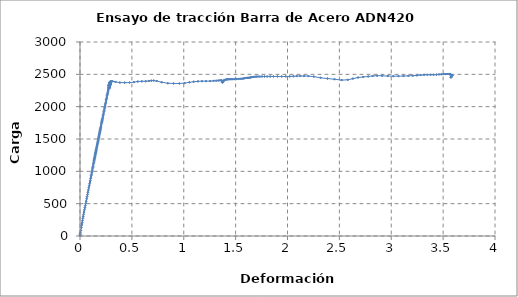
| Category | Series 0 |
|---|---|
| 0.0 | 20.252 |
| 0.0003 | 2.587 |
| 0.0011 | 17.122 |
| 0.0022 | 31.6 |
| 0.004 | 50.392 |
| 0.0077 | 84.81 |
| 0.0124 | 131.125 |
| 0.0156 | 165.035 |
| 0.0178 | 186.205 |
| 0.0202 | 208.553 |
| 0.0237 | 239.546 |
| 0.0274 | 273.107 |
| 0.0308 | 304.433 |
| 0.0346 | 336.48 |
| 0.0386 | 369.845 |
| 0.0427 | 402.87 |
| 0.0468 | 436.396 |
| 0.0511 | 470.818 |
| 0.0555 | 505 |
| 0.0599 | 539.282 |
| 0.064 | 574.271 |
| 0.0681 | 608.578 |
| 0.0726 | 642.638 |
| 0.0768 | 676.378 |
| 0.0808 | 710.499 |
| 0.0848 | 744.043 |
| 0.0889 | 776.463 |
| 0.0926 | 806.376 |
| 0.0961 | 834.854 |
| 0.0994 | 861.845 |
| 0.1025 | 887.574 |
| 0.1054 | 911.499 |
| 0.1081 | 934.991 |
| 0.1108 | 957.132 |
| 0.1134 | 977.642 |
| 0.1159 | 997.762 |
| 0.1182 | 1018.121 |
| 0.1205 | 1038.109 |
| 0.1229 | 1058.009 |
| 0.1255 | 1078.018 |
| 0.1279 | 1098.199 |
| 0.1302 | 1119.034 |
| 0.1327 | 1138.983 |
| 0.1349 | 1157.536 |
| 0.1361 | 1169.744 |
| 0.137 | 1178.703 |
| 0.1385 | 1191.244 |
| 0.1401 | 1203.536 |
| 0.1418 | 1214.996 |
| 0.1433 | 1226.086 |
| 0.1447 | 1237.422 |
| 0.146 | 1248.94 |
| 0.1473 | 1260.346 |
| 0.1486 | 1271.864 |
| 0.1499 | 1282.808 |
| 0.1515 | 1293.88 |
| 0.153 | 1305.526 |
| 0.1544 | 1316.569 |
| 0.1556 | 1327.424 |
| 0.157 | 1339.923 |
| 0.1587 | 1353.095 |
| 0.1604 | 1366.406 |
| 0.162 | 1379.584 |
| 0.1637 | 1392.507 |
| 0.1654 | 1405.933 |
| 0.1672 | 1418.77 |
| 0.169 | 1431.317 |
| 0.1707 | 1444.793 |
| 0.1723 | 1458.19 |
| 0.1739 | 1470.752 |
| 0.1754 | 1483.403 |
| 0.1771 | 1497.101 |
| 0.1788 | 1509.976 |
| 0.1804 | 1522.771 |
| 0.182 | 1536.359 |
| 0.1836 | 1549.864 |
| 0.1852 | 1563.447 |
| 0.1869 | 1576.919 |
| 0.1887 | 1590.353 |
| 0.1904 | 1604.173 |
| 0.1921 | 1617.648 |
| 0.1937 | 1630.912 |
| 0.1953 | 1644.644 |
| 0.197 | 1658.337 |
| 0.1989 | 1671.729 |
| 0.2006 | 1685.124 |
| 0.2024 | 1699.4 |
| 0.2045 | 1717.195 |
| 0.2067 | 1735.7 |
| 0.2088 | 1752.927 |
| 0.2109 | 1769.199 |
| 0.213 | 1785.744 |
| 0.2152 | 1802.355 |
| 0.2173 | 1819.213 |
| 0.2197 | 1838.036 |
| 0.2224 | 1859.03 |
| 0.225 | 1880.588 |
| 0.2276 | 1901.818 |
| 0.2302 | 1922.927 |
| 0.2329 | 1944.014 |
| 0.2356 | 1965.342 |
| 0.2383 | 1986.516 |
| 0.241 | 2007.351 |
| 0.2435 | 2027.934 |
| 0.2459 | 2048.13 |
| 0.2485 | 2068.718 |
| 0.2511 | 2089.058 |
| 0.2537 | 2109.135 |
| 0.256 | 2129.117 |
| 0.2584 | 2148.899 |
| 0.2608 | 2168.698 |
| 0.2632 | 2187.789 |
| 0.2656 | 2205.858 |
| 0.2679 | 2223.226 |
| 0.2701 | 2240.559 |
| 0.2721 | 2257.028 |
| 0.2739 | 2271.59 |
| 0.2754 | 2284.724 |
| 0.277 | 2296.841 |
| 0.2786 | 2309.466 |
| 0.2801 | 2322.302 |
| 0.2816 | 2332.947 |
| 0.2826 | 2340.655 |
| 0.2829 | 2343.912 |
| 0.2829 | 2342.713 |
| 0.2827 | 2328.255 |
| 0.2824 | 2305.382 |
| 0.2823 | 2293.38 |
| 0.2823 | 2291.865 |
| 0.2825 | 2292.494 |
| 0.2824 | 2293.444 |
| 0.2824 | 2294.837 |
| 0.2823 | 2295.813 |
| 0.2823 | 2293.757 |
| 0.2822 | 2289.784 |
| 0.2822 | 2287.394 |
| 0.2823 | 2287.536 |
| 0.2823 | 2291.576 |
| 0.2823 | 2298.981 |
| 0.2825 | 2306.908 |
| 0.2825 | 2314.133 |
| 0.2824 | 2319.514 |
| 0.2824 | 2324.425 |
| 0.2825 | 2328.965 |
| 0.2826 | 2330.46 |
| 0.2826 | 2329.099 |
| 0.2824 | 2325.907 |
| 0.2824 | 2322.364 |
| 0.2825 | 2320.977 |
| 0.2825 | 2320.819 |
| 0.2824 | 2321.028 |
| 0.2824 | 2322.32 |
| 0.2825 | 2324.188 |
| 0.2824 | 2324.896 |
| 0.2824 | 2326.439 |
| 0.2824 | 2328.544 |
| 0.2825 | 2328.876 |
| 0.2825 | 2328.828 |
| 0.2826 | 2329.976 |
| 0.2826 | 2332.974 |
| 0.2826 | 2335.172 |
| 0.2826 | 2334.534 |
| 0.2826 | 2333.924 |
| 0.2827 | 2334.774 |
| 0.2827 | 2336.736 |
| 0.2832 | 2341.441 |
| 0.2846 | 2349.695 |
| 0.2857 | 2357.464 |
| 0.2861 | 2360.794 |
| 0.2861 | 2362.332 |
| 0.2865 | 2365.658 |
| 0.2871 | 2368.932 |
| 0.2874 | 2370.21 |
| 0.2875 | 2368.027 |
| 0.2875 | 2365.389 |
| 0.2877 | 2368.166 |
| 0.2883 | 2374.272 |
| 0.2889 | 2378.527 |
| 0.289 | 2378.576 |
| 0.289 | 2372.524 |
| 0.2891 | 2363.6 |
| 0.2891 | 2358.206 |
| 0.2891 | 2356.979 |
| 0.2892 | 2357.518 |
| 0.2892 | 2358.307 |
| 0.2891 | 2352.696 |
| 0.289 | 2344.218 |
| 0.2889 | 2341.188 |
| 0.2889 | 2339.411 |
| 0.2888 | 2336.646 |
| 0.2888 | 2336.129 |
| 0.2889 | 2340.492 |
| 0.2889 | 2347.5 |
| 0.2889 | 2347.732 |
| 0.2888 | 2340.598 |
| 0.2888 | 2336.224 |
| 0.2888 | 2335.679 |
| 0.2888 | 2336.302 |
| 0.2888 | 2344.869 |
| 0.2889 | 2357.874 |
| 0.289 | 2365.487 |
| 0.289 | 2367.335 |
| 0.289 | 2364.825 |
| 0.2889 | 2358.555 |
| 0.2889 | 2353.921 |
| 0.2889 | 2354.028 |
| 0.2888 | 2355.803 |
| 0.2889 | 2357.258 |
| 0.2889 | 2357.696 |
| 0.2888 | 2356.885 |
| 0.2887 | 2348.767 |
| 0.2885 | 2327.922 |
| 0.2884 | 2321.1 |
| 0.2886 | 2344.582 |
| 0.2894 | 2369.315 |
| 0.2908 | 2384.343 |
| 0.2928 | 2390.792 |
| 0.2968 | 2391.709 |
| 0.3033 | 2392.281 |
| 0.3147 | 2392.346 |
| 0.342 | 2382.713 |
| 0.3841 | 2372.302 |
| 0.4309 | 2371.423 |
| 0.4777 | 2372.282 |
| 0.5195 | 2379.375 |
| 0.5576 | 2388.691 |
| 0.5962 | 2391.894 |
| 0.6335 | 2393.15 |
| 0.6642 | 2397.654 |
| 0.6879 | 2402.379 |
| 0.7096 | 2403.398 |
| 0.739 | 2396.916 |
| 0.7875 | 2378.154 |
| 0.8463 | 2362.039 |
| 0.9023 | 2358.891 |
| 0.9571 | 2358.284 |
| 1.0078 | 2363.991 |
| 1.0535 | 2376.299 |
| 1.096 | 2385.726 |
| 1.1367 | 2391.366 |
| 1.1752 | 2394.197 |
| 1.2147 | 2394.756 |
| 1.254 | 2395.843 |
| 1.287 | 2398.777 |
| 1.3121 | 2401.933 |
| 1.3317 | 2404.312 |
| 1.3491 | 2407.181 |
| 1.3641 | 2410.378 |
| 1.3718 | 2395.791 |
| 1.3728 | 2377.052 |
| 1.374 | 2376.515 |
| 1.3769 | 2385.232 |
| 1.381 | 2394.642 |
| 1.3865 | 2403.645 |
| 1.3935 | 2411.948 |
| 1.402 | 2417.826 |
| 1.4113 | 2420.808 |
| 1.4207 | 2422.061 |
| 1.4301 | 2423.534 |
| 1.4395 | 2424.878 |
| 1.4498 | 2425.339 |
| 1.4613 | 2425.395 |
| 1.4747 | 2425.26 |
| 1.4908 | 2425.763 |
| 1.5099 | 2427.564 |
| 1.53 | 2429.683 |
| 1.5474 | 2430.706 |
| 1.5615 | 2431.898 |
| 1.5738 | 2435.084 |
| 1.585 | 2439.701 |
| 1.5951 | 2443.256 |
| 1.6043 | 2444.506 |
| 1.6131 | 2445.238 |
| 1.6217 | 2445.673 |
| 1.6298 | 2446.302 |
| 1.6377 | 2448.664 |
| 1.6458 | 2452.631 |
| 1.6545 | 2456.361 |
| 1.6641 | 2458.814 |
| 1.6753 | 2460.898 |
| 1.6878 | 2462.557 |
| 1.7011 | 2464.254 |
| 1.7164 | 2465.506 |
| 1.7344 | 2465.965 |
| 1.7553 | 2466.251 |
| 1.7786 | 2466.694 |
| 1.8042 | 2467.001 |
| 1.8325 | 2467.333 |
| 1.8648 | 2467.603 |
| 1.9032 | 2467.131 |
| 1.9438 | 2466.854 |
| 1.9834 | 2467.024 |
| 2.0215 | 2467.367 |
| 2.0562 | 2469.757 |
| 2.089 | 2472.911 |
| 2.1237 | 2473.9 |
| 2.1601 | 2473.894 |
| 2.2008 | 2472.998 |
| 2.2537 | 2464.476 |
| 2.3185 | 2446.872 |
| 2.3846 | 2434.888 |
| 2.4528 | 2424.29 |
| 2.522 | 2411.058 |
| 2.5805 | 2415.308 |
| 2.6307 | 2433.595 |
| 2.6801 | 2450.136 |
| 2.73 | 2459.656 |
| 2.7779 | 2466.507 |
| 2.8207 | 2474.125 |
| 2.8633 | 2479.073 |
| 2.9129 | 2477.5 |
| 2.9672 | 2473.273 |
| 3.0198 | 2471.596 |
| 3.0695 | 2472.223 |
| 3.118 | 2473.754 |
| 3.1648 | 2476.21 |
| 3.2085 | 2479.454 |
| 3.2475 | 2483.748 |
| 3.2835 | 2488.451 |
| 3.3166 | 2491.829 |
| 3.348 | 2493.117 |
| 3.3782 | 2493.304 |
| 3.4078 | 2493.705 |
| 3.4357 | 2495.26 |
| 3.4603 | 2498.069 |
| 3.482 | 2500.89 |
| 3.5016 | 2503.319 |
| 3.5198 | 2504.506 |
| 3.5369 | 2505.029 |
| 3.5518 | 2505.462 |
| 3.5638 | 2505.445 |
| 3.5721 | 2501.133 |
| 3.5754 | 2478.616 |
| 3.5755 | 2456.358 |
| 3.5756 | 2452.626 |
| 3.5768 | 2459.442 |
| 3.5801 | 2471.77 |
| 3.5846 | 2481.502 |
| 3.5883 | 2484.953 |